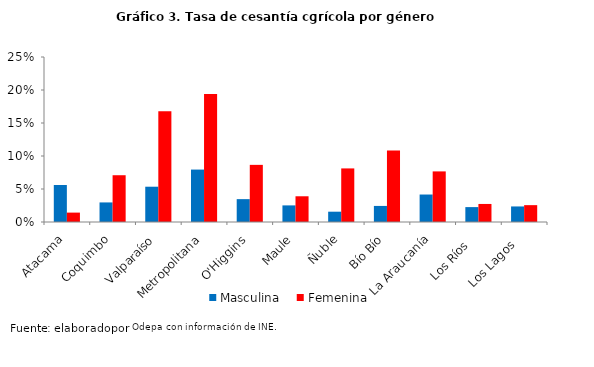
| Category | Masculina | Femenina |
|---|---|---|
| Atacama | 0.056 | 0.014 |
| Coquimbo | 0.03 | 0.071 |
| Valparaíso | 0.053 | 0.168 |
| Metropolitana | 0.079 | 0.194 |
| O'Higgins | 0.035 | 0.087 |
| Maule | 0.025 | 0.039 |
| Ñuble | 0.016 | 0.081 |
| Bío Bío | 0.024 | 0.108 |
| La Araucanía | 0.042 | 0.077 |
| Los Ríos   | 0.023 | 0.027 |
| Los Lagos   | 0.024 | 0.026 |